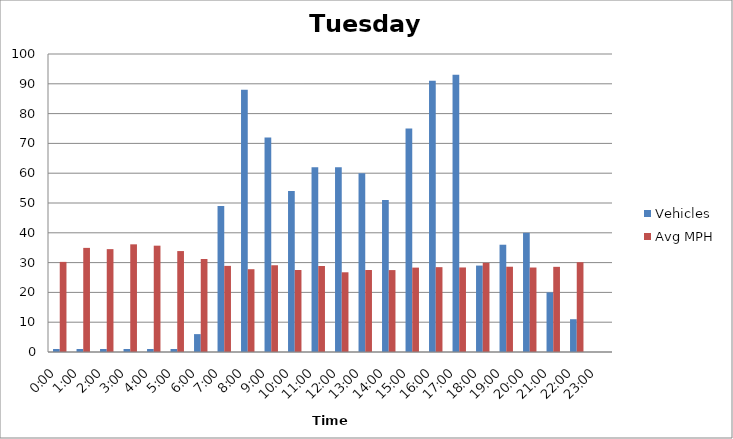
| Category | Vehicles | Avg MPH |
|---|---|---|
| 0:00 | 1 | 30.24 |
| 1:00 | 1 | 34.94 |
| 2:00 | 1 | 34.52 |
| 3:00 | 1 | 36.13 |
| 4:00 | 1 | 35.68 |
| 5:00 | 1 | 33.87 |
| 6:00 | 6 | 31.21 |
| 7:00 | 49 | 28.9 |
| 8:00 | 88 | 27.78 |
| 9:00 | 72 | 29.11 |
| 10:00 | 54 | 27.51 |
| 11:00 | 62 | 28.86 |
| 12:00 | 62 | 26.75 |
| 13:00 | 60 | 27.51 |
| 14:00 | 51 | 27.49 |
| 15:00 | 75 | 28.32 |
| 16:00 | 91 | 28.47 |
| 17:00 | 93 | 28.37 |
| 18:00 | 29 | 29.93 |
| 19:00 | 36 | 28.62 |
| 20:00 | 40 | 28.35 |
| 21:00 | 20 | 28.58 |
| 22:00 | 11 | 30.13 |
| 23:00 | 0 | 0 |